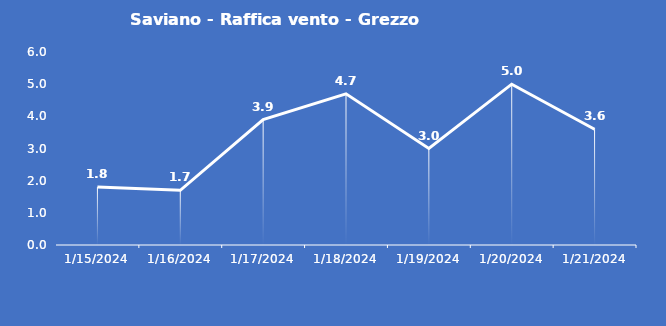
| Category | Saviano - Raffica vento - Grezzo (m/s) |
|---|---|
| 1/15/24 | 1.8 |
| 1/16/24 | 1.7 |
| 1/17/24 | 3.9 |
| 1/18/24 | 4.7 |
| 1/19/24 | 3 |
| 1/20/24 | 5 |
| 1/21/24 | 3.6 |